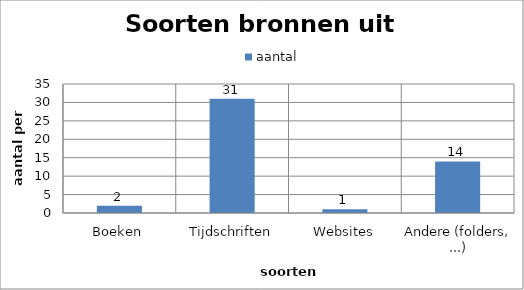
| Category | aantal |
|---|---|
| Boeken | 2 |
| Tijdschriften | 31 |
| Websites | 1 |
| Andere (folders, ...) | 14 |